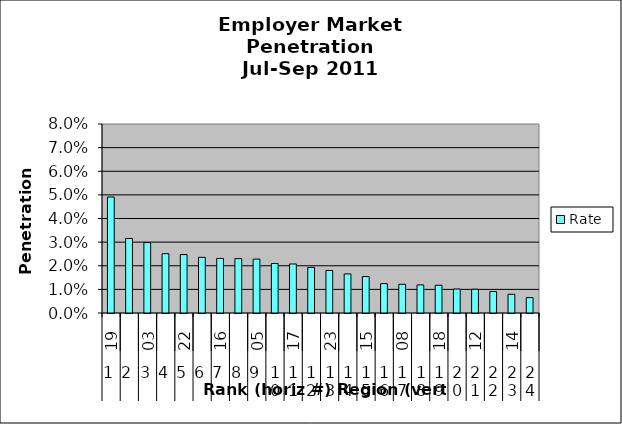
| Category | Rate |
|---|---|
| 0 | 0.049 |
| 1 | 0.032 |
| 2 | 0.03 |
| 3 | 0.025 |
| 4 | 0.025 |
| 5 | 0.024 |
| 6 | 0.023 |
| 7 | 0.023 |
| 8 | 0.023 |
| 9 | 0.021 |
| 10 | 0.021 |
| 11 | 0.019 |
| 12 | 0.018 |
| 13 | 0.017 |
| 14 | 0.015 |
| 15 | 0.012 |
| 16 | 0.012 |
| 17 | 0.012 |
| 18 | 0.012 |
| 19 | 0.01 |
| 20 | 0.01 |
| 21 | 0.009 |
| 22 | 0.008 |
| 23 | 0.007 |